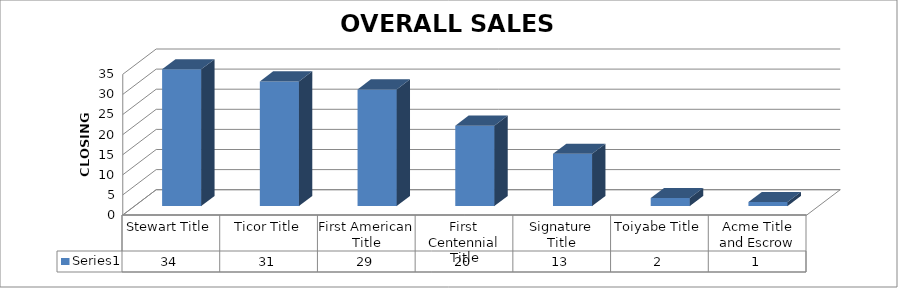
| Category | Series 0 |
|---|---|
| Stewart Title | 34 |
| Ticor Title | 31 |
| First American Title | 29 |
| First Centennial Title | 20 |
| Signature Title | 13 |
| Toiyabe Title | 2 |
| Acme Title and Escrow | 1 |